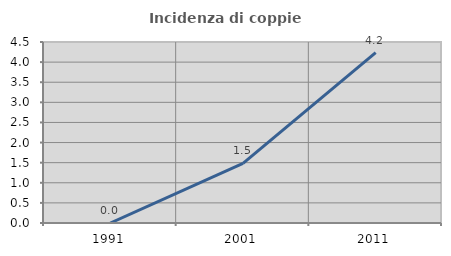
| Category | Incidenza di coppie miste |
|---|---|
| 1991.0 | 0 |
| 2001.0 | 1.48 |
| 2011.0 | 4.237 |